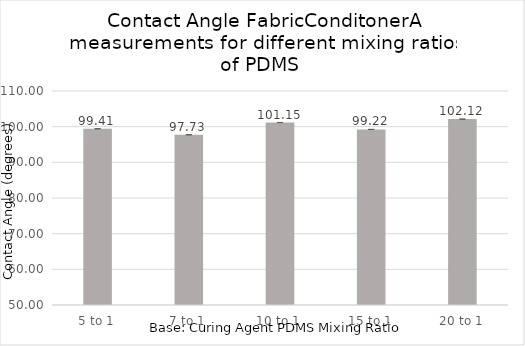
| Category | Series 0 |
|---|---|
| 5 to 1 | 99.413 |
| 7 to 1 | 97.733 |
| 10 to 1 | 101.15 |
| 15 to 1 | 99.223 |
| 20 to 1 | 102.117 |